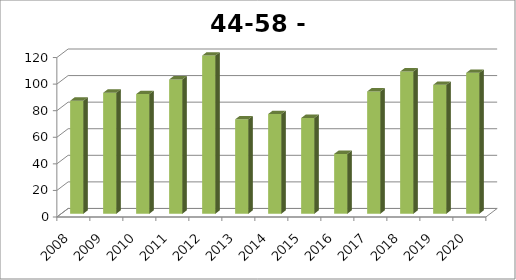
| Category | Series 0 |
|---|---|
| 2008.0 | 85 |
| 2009.0 | 91 |
| 2010.0 | 90 |
| 2011.0 | 101 |
| 2012.0 | 119 |
| 2013.0 | 71 |
| 2014.0 | 75 |
| 2015.0 | 72 |
| 2016.0 | 45 |
| 2017.0 | 92 |
| 2018.0 | 107 |
| 2019.0 | 97 |
| 2020.0 | 106 |